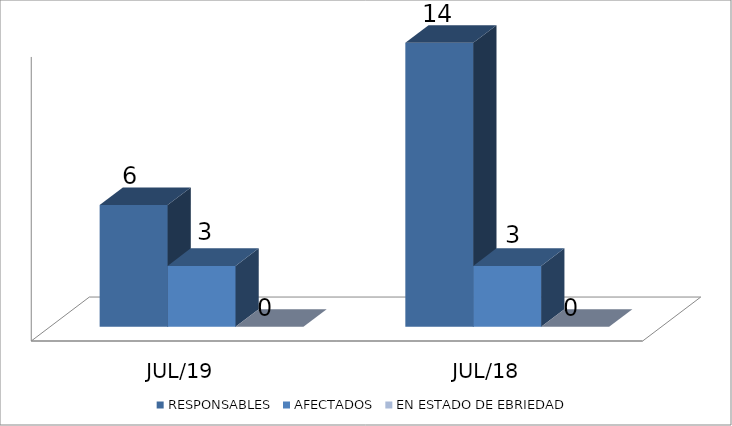
| Category | RESPONSABLES | AFECTADOS | EN ESTADO DE EBRIEDAD |
|---|---|---|---|
| JUL/19 | 6 | 3 | 0 |
| JUL/18 | 14 | 3 | 0 |